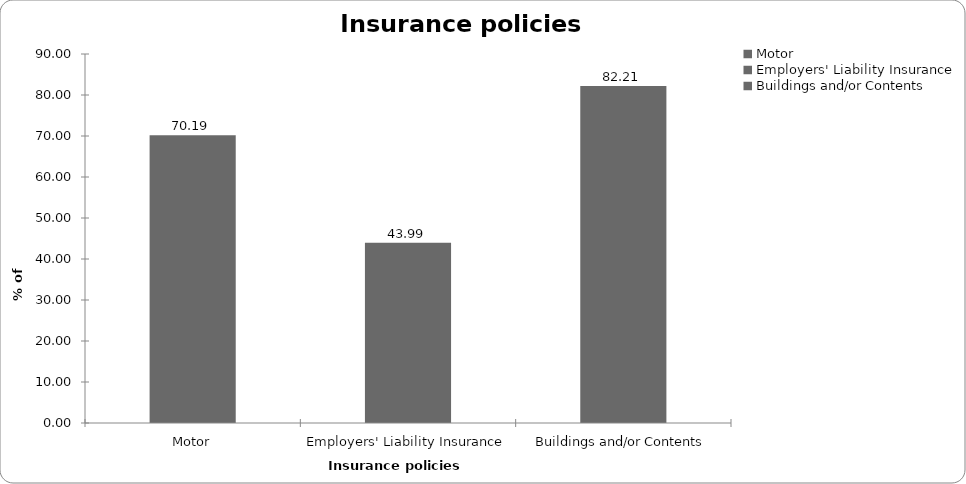
| Category | Insurance policies held |
|---|---|
| Motor | 70.19 |
| Employers' Liability Insurance | 43.992 |
| Buildings and/or Contents | 82.206 |